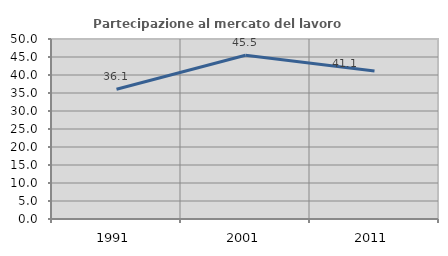
| Category | Partecipazione al mercato del lavoro  femminile |
|---|---|
| 1991.0 | 36.059 |
| 2001.0 | 45.489 |
| 2011.0 | 41.126 |